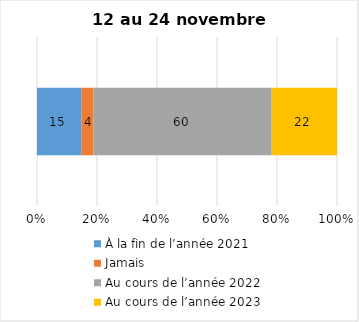
| Category | À la fin de l’année 2021 | Jamais | Au cours de l’année 2022 | Au cours de l’année 2023 |
|---|---|---|---|---|
| 0 | 15 | 4 | 60 | 22 |